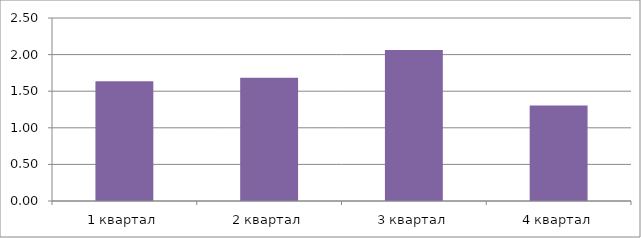
| Category | Рентабельность заемных средств, % |
|---|---|
| 1 квартал | 1.636 |
| 2 квартал | 1.683 |
| 3 квартал | 2.062 |
| 4 квартал | 1.305 |